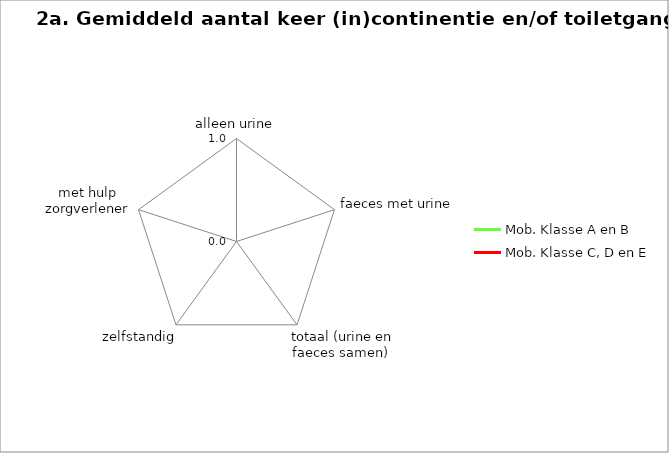
| Category | Mob. Klasse A en B | Mob. Klasse C, D en E |
|---|---|---|
| alleen urine | 0 | 0 |
| faeces met urine | 0 | 0 |
| totaal (urine en faeces samen)  | 0 | 0 |
| zelfstandig | 0 | 0 |
| met hulp zorgverlener | 0 | 0 |